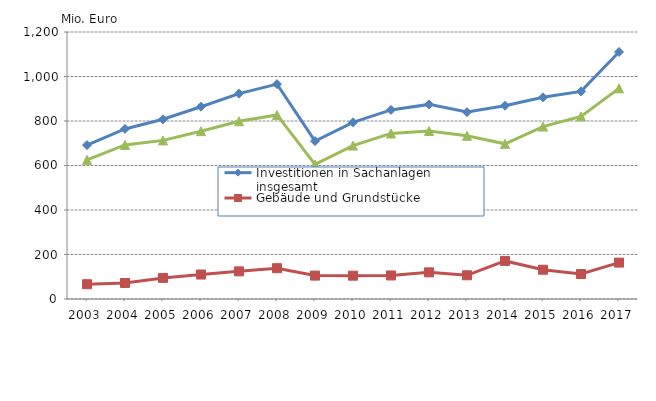
| Category | Investitionen in Sachanlagen insgesamt | Gebäude und Grundstücke | Maschinen und Betriebsausstattung |
|---|---|---|---|
| 2003.0 | 691840 | 66441 | 625399 |
| 2004.0 | 764337 | 71810 | 692527 |
| 2005.0 | 807730 | 94864 | 712866 |
| 2006.0 | 864202 | 109907 | 754295 |
| 2007.0 | 922931 | 124199 | 798732 |
| 2008.0 | 965705 | 138389 | 827316 |
| 2009.0 | 710022 | 105189 | 604833 |
| 2010.0 | 794111 | 104710 | 689400 |
| 2011.0 | 849848.946 | 105760 | 744088.575 |
| 2012.0 | 874647.991 | 119797 | 754850.66 |
| 2013.0 | 840136.552 | 106586 | 733550.844 |
| 2014.0 | 868614.61 | 171128 | 697486.539 |
| 2015.0 | 906511.133 | 131559.378 | 774951.755 |
| 2016.0 | 933005.993 | 112203.211 | 820802.782 |
| 2017.0 | 1110213.856 | 163523.751 | 946690.105 |